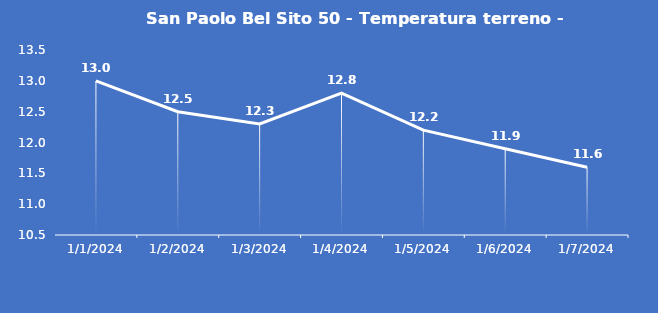
| Category | San Paolo Bel Sito 50 - Temperatura terreno - Grezzo (°C) |
|---|---|
| 1/1/24 | 13 |
| 1/2/24 | 12.5 |
| 1/3/24 | 12.3 |
| 1/4/24 | 12.8 |
| 1/5/24 | 12.2 |
| 1/6/24 | 11.9 |
| 1/7/24 | 11.6 |